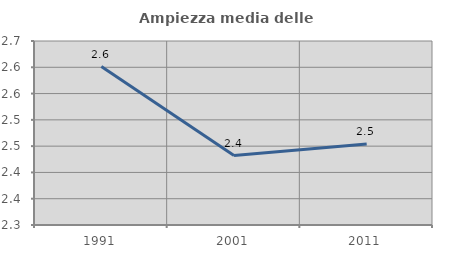
| Category | Ampiezza media delle famiglie |
|---|---|
| 1991.0 | 2.601 |
| 2001.0 | 2.432 |
| 2011.0 | 2.454 |